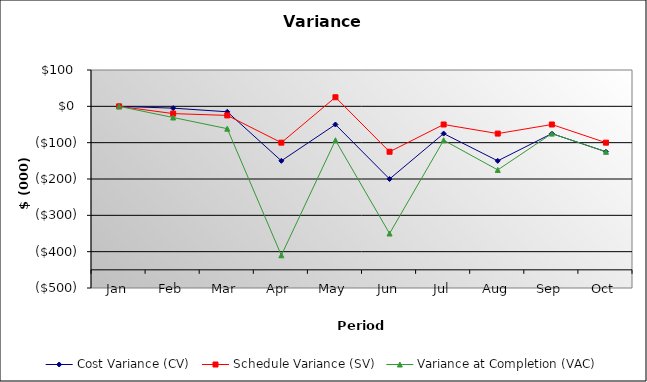
| Category | Cost Variance (CV) | Schedule Variance (SV) | Variance at Completion (VAC) |
|---|---|---|---|
| Jan | 0 | 0 | 0 |
| Feb | -5 | -20 | -30.75 |
| Mar | -15 | -25 | -61.5 |
| Apr | -150 | -100 | -410 |
| May | -50 | 25 | -93.333 |
| Jun | -200 | -125 | -350 |
| Jul | -75 | -50 | -93.333 |
| Aug | -150 | -75 | -175 |
| Sep | -75 | -50 | -75 |
| Oct | -125 | -100 | -125 |